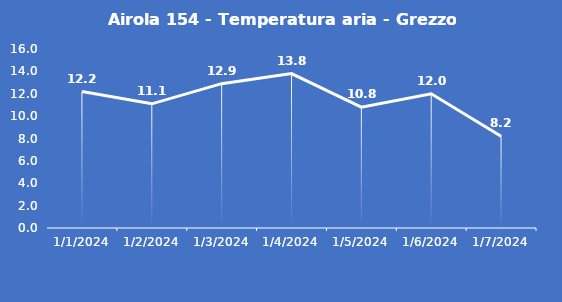
| Category | Airola 154 - Temperatura aria - Grezzo (°C) |
|---|---|
| 1/1/24 | 12.2 |
| 1/2/24 | 11.1 |
| 1/3/24 | 12.9 |
| 1/4/24 | 13.8 |
| 1/5/24 | 10.8 |
| 1/6/24 | 12 |
| 1/7/24 | 8.2 |